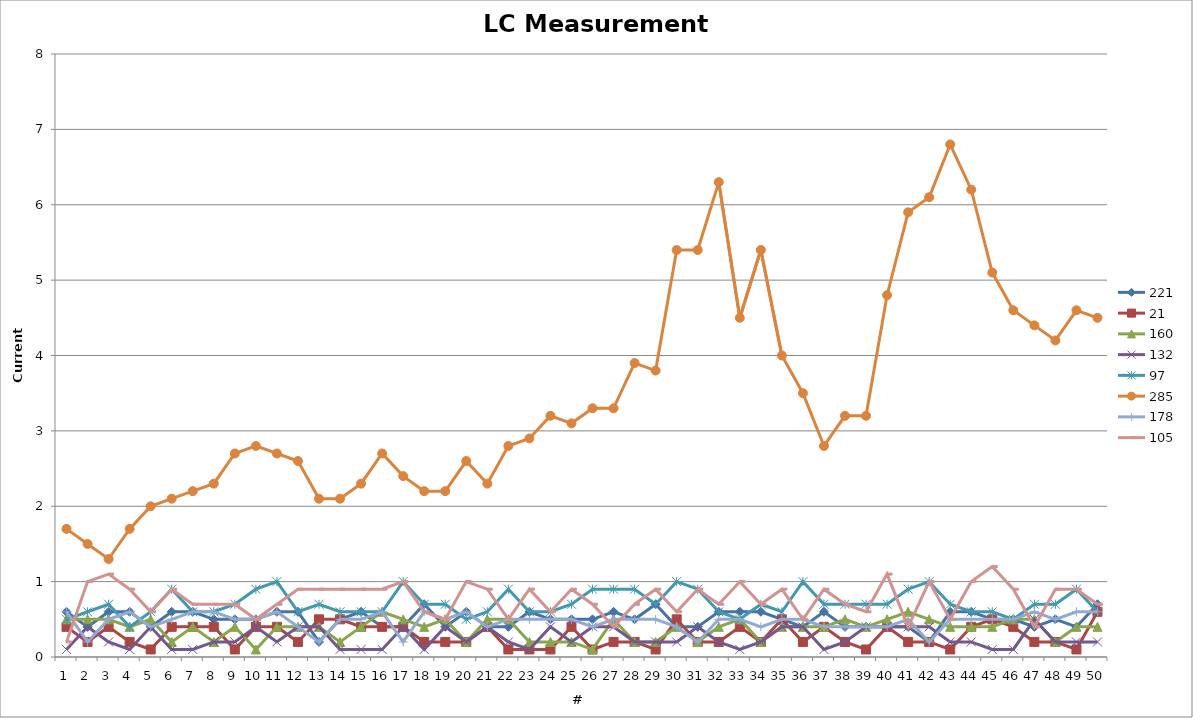
| Category | 221 | 21 | 160 | 132 | 97 | 285 | 178 | 105 |
|---|---|---|---|---|---|---|---|---|
| 0 | 0.6 | 0.4 | 0.5 | 0.1 | 0.5 | 1.7 | 0.6 | 0.2 |
| 1 | 0.4 | 0.2 | 0.5 | 0.4 | 0.6 | 1.5 | 0.2 | 1 |
| 2 | 0.6 | 0.4 | 0.5 | 0.2 | 0.7 | 1.3 | 0.5 | 1.1 |
| 3 | 0.6 | 0.2 | 0.4 | 0.1 | 0.4 | 1.7 | 0.6 | 0.9 |
| 4 | 0.4 | 0.1 | 0.5 | 0.4 | 0.6 | 2 | 0.4 | 0.6 |
| 5 | 0.6 | 0.4 | 0.2 | 0.1 | 0.9 | 2.1 | 0.5 | 0.9 |
| 6 | 0.6 | 0.4 | 0.4 | 0.1 | 0.6 | 2.2 | 0.6 | 0.7 |
| 7 | 0.5 | 0.4 | 0.2 | 0.2 | 0.6 | 2.3 | 0.6 | 0.7 |
| 8 | 0.5 | 0.1 | 0.4 | 0.2 | 0.7 | 2.7 | 0.5 | 0.7 |
| 9 | 0.5 | 0.4 | 0.1 | 0.4 | 0.9 | 2.8 | 0.5 | 0.5 |
| 10 | 0.6 | 0.4 | 0.4 | 0.2 | 1 | 2.7 | 0.6 | 0.7 |
| 11 | 0.6 | 0.2 | 0.4 | 0.4 | 0.6 | 2.6 | 0.4 | 0.9 |
| 12 | 0.2 | 0.5 | 0.4 | 0.4 | 0.7 | 2.1 | 0.2 | 0.9 |
| 13 | 0.5 | 0.5 | 0.2 | 0.1 | 0.6 | 2.1 | 0.5 | 0.9 |
| 14 | 0.6 | 0.4 | 0.4 | 0.1 | 0.6 | 2.3 | 0.5 | 0.9 |
| 15 | 0.4 | 0.4 | 0.6 | 0.1 | 0.6 | 2.7 | 0.6 | 0.9 |
| 16 | 0.4 | 0.4 | 0.5 | 0.4 | 1 | 2.4 | 0.2 | 1 |
| 17 | 0.7 | 0.2 | 0.4 | 0.1 | 0.7 | 2.2 | 0.6 | 0.6 |
| 18 | 0.4 | 0.2 | 0.5 | 0.4 | 0.7 | 2.2 | 0.5 | 0.5 |
| 19 | 0.6 | 0.2 | 0.2 | 0.2 | 0.5 | 2.6 | 0.6 | 1 |
| 20 | 0.4 | 0.4 | 0.5 | 0.4 | 0.6 | 2.3 | 0.4 | 0.9 |
| 21 | 0.4 | 0.1 | 0.5 | 0.2 | 0.9 | 2.8 | 0.5 | 0.5 |
| 22 | 0.6 | 0.1 | 0.2 | 0.1 | 0.6 | 2.9 | 0.5 | 0.9 |
| 23 | 0.5 | 0.1 | 0.2 | 0.4 | 0.6 | 3.2 | 0.5 | 0.6 |
| 24 | 0.5 | 0.4 | 0.2 | 0.2 | 0.7 | 3.1 | 0.5 | 0.9 |
| 25 | 0.5 | 0.1 | 0.1 | 0.4 | 0.9 | 3.3 | 0.4 | 0.7 |
| 26 | 0.6 | 0.2 | 0.5 | 0.4 | 0.9 | 3.3 | 0.5 | 0.4 |
| 27 | 0.5 | 0.2 | 0.2 | 0.2 | 0.9 | 3.9 | 0.5 | 0.7 |
| 28 | 0.7 | 0.1 | 0.2 | 0.2 | 0.7 | 3.8 | 0.5 | 0.9 |
| 29 | 0.4 | 0.5 | 0.4 | 0.2 | 1 | 5.4 | 0.4 | 0.6 |
| 30 | 0.4 | 0.2 | 0.2 | 0.4 | 0.9 | 5.4 | 0.2 | 0.9 |
| 31 | 0.6 | 0.2 | 0.4 | 0.2 | 0.6 | 6.3 | 0.5 | 0.7 |
| 32 | 0.6 | 0.4 | 0.5 | 0.1 | 0.5 | 4.5 | 0.5 | 1 |
| 33 | 0.6 | 0.2 | 0.2 | 0.2 | 0.7 | 5.4 | 0.4 | 0.7 |
| 34 | 0.5 | 0.5 | 0.4 | 0.4 | 0.6 | 4 | 0.5 | 0.9 |
| 35 | 0.4 | 0.2 | 0.4 | 0.4 | 1 | 3.5 | 0.5 | 0.5 |
| 36 | 0.6 | 0.4 | 0.4 | 0.1 | 0.7 | 2.8 | 0.4 | 0.9 |
| 37 | 0.4 | 0.2 | 0.5 | 0.2 | 0.7 | 3.2 | 0.4 | 0.7 |
| 38 | 0.4 | 0.1 | 0.4 | 0.4 | 0.7 | 3.2 | 0.4 | 0.6 |
| 39 | 0.4 | 0.4 | 0.5 | 0.4 | 0.7 | 4.8 | 0.4 | 1.1 |
| 40 | 0.4 | 0.2 | 0.6 | 0.4 | 0.9 | 5.9 | 0.5 | 0.4 |
| 41 | 0.2 | 0.2 | 0.5 | 0.4 | 1 | 6.1 | 0.2 | 1 |
| 42 | 0.6 | 0.1 | 0.4 | 0.2 | 0.7 | 6.8 | 0.5 | 0.5 |
| 43 | 0.6 | 0.4 | 0.4 | 0.2 | 0.6 | 6.2 | 0.5 | 1 |
| 44 | 0.5 | 0.5 | 0.4 | 0.1 | 0.6 | 5.1 | 0.5 | 1.2 |
| 45 | 0.5 | 0.4 | 0.5 | 0.1 | 0.5 | 4.6 | 0.5 | 0.9 |
| 46 | 0.4 | 0.2 | 0.5 | 0.5 | 0.7 | 4.4 | 0.6 | 0.4 |
| 47 | 0.5 | 0.2 | 0.2 | 0.2 | 0.7 | 4.2 | 0.5 | 0.9 |
| 48 | 0.4 | 0.1 | 0.4 | 0.2 | 0.9 | 4.6 | 0.6 | 0.9 |
| 49 | 0.7 | 0.6 | 0.4 | 0.2 | 0.6 | 4.5 | 0.6 | 0.7 |